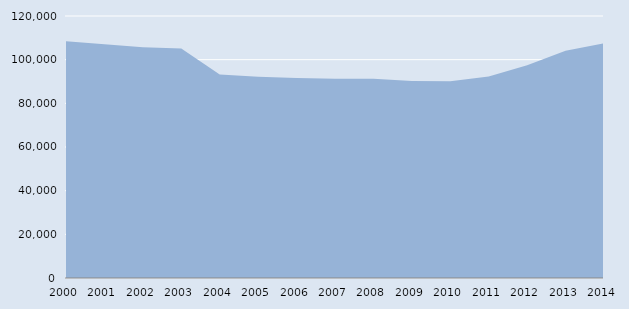
| Category | Series 0 |
|---|---|
| 2000.0 | 108397 |
| 2001.0 | 107057 |
| 2002.0 | 105667 |
| 2003.0 | 105135 |
| 2004.0 | 93190 |
| 2005.0 | 92136 |
| 2006.0 | 91651 |
| 2007.0 | 91253 |
| 2008.0 | 91225 |
| 2009.0 | 90203 |
| 2010.0 | 90148 |
| 2011.0 | 92343 |
| 2012.0 | 97445 |
| 2013.0 | 104084 |
| 2014.0 | 107470 |